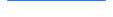
| Category | Series 0 |
|---|---|
| 0 | 1985.006 |
| 1 | 1989.474 |
| 2 | 2075 |
| 3 | 1921.348 |
| 4 | 2043.25 |
| 5 | 1975 |
| 6 | 2000 |
| 7 | 1921 |
| 8 | 2006 |